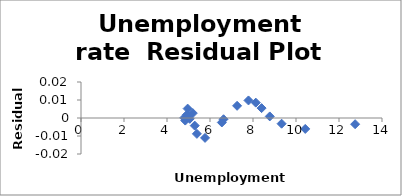
| Category | Series 0 |
|---|---|
| 12.75 | -0.003 |
| 10.43 | -0.006 |
| 9.33 | -0.003 |
| 8.78 | 0.001 |
| 8.4 | 0.005 |
| 8.13 | 0.009 |
| 7.79 | 0.01 |
| 7.26 | 0.007 |
| 6.63 | -0.001 |
| 6.55 | -0.002 |
| 5.77 | -0.011 |
| 5.39 | -0.009 |
| 5.29 | -0.004 |
| 5.2 | 0.003 |
| 5.06 | 0 |
| 4.93 | 0.002 |
| 4.96 | 0.005 |
| 4.9 | 0.001 |
| 4.85 | -0.001 |
| 4.8 | 0 |